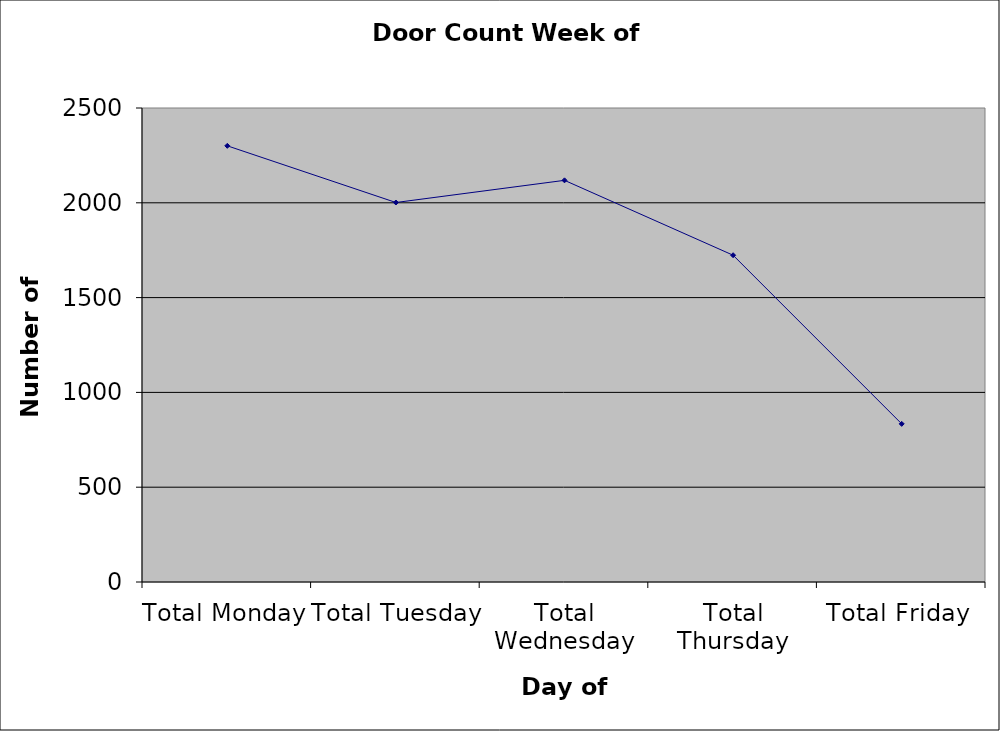
| Category | Series 0 |
|---|---|
| Total Monday | 2300.5 |
| Total Tuesday | 2001.5 |
| Total Wednesday | 2118.5 |
| Total Thursday | 1723.5 |
| Total Friday | 834 |